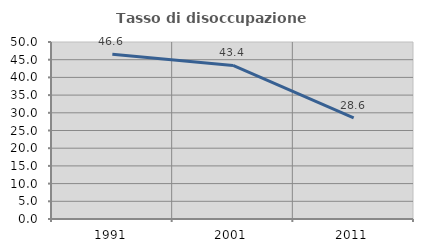
| Category | Tasso di disoccupazione giovanile  |
|---|---|
| 1991.0 | 46.569 |
| 2001.0 | 43.363 |
| 2011.0 | 28.571 |